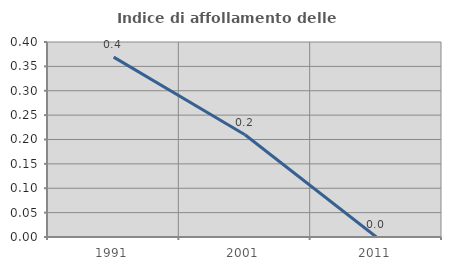
| Category | Indice di affollamento delle abitazioni  |
|---|---|
| 1991.0 | 0.369 |
| 2001.0 | 0.21 |
| 2011.0 | 0 |